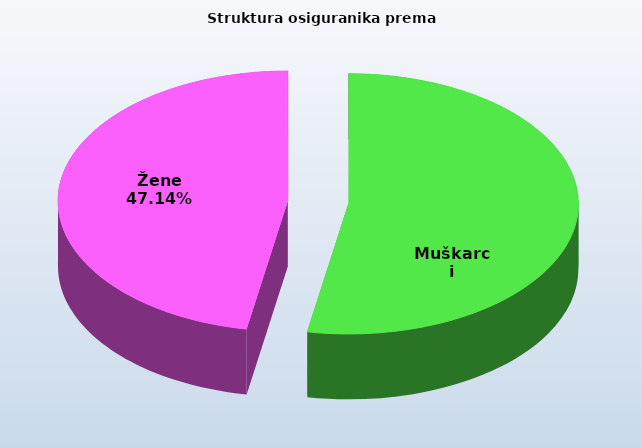
| Category | Series 0 |
|---|---|
| Muškarci | 832068 |
| Žene | 741881 |